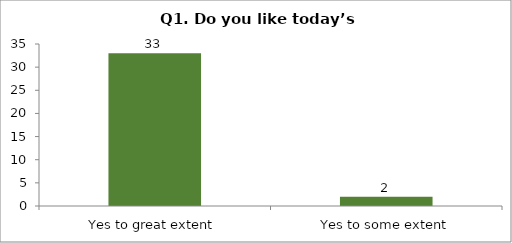
| Category | Q1. Do you like today’s session? |
|---|---|
| Yes to great extent | 33 |
| Yes to some extent | 2 |